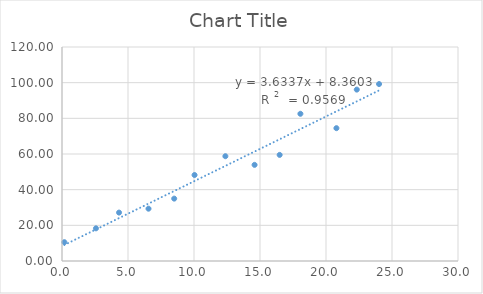
| Category | Series 0 |
|---|---|
| 0.17908833236415345 | 10.546 |
| 2.57302876919328 | 18.319 |
| 4.321392241195258 | 27.148 |
| 6.553315780896324 | 29.333 |
| 8.500213754776183 | 34.978 |
| 10.041796081907918 | 48.218 |
| 12.377698217533624 | 58.756 |
| 14.588588238960307 | 53.913 |
| 16.48885090078175 | 59.494 |
| 18.06068892523254 | 82.552 |
| 20.789195307454953 | 74.484 |
| 22.332024793597032 | 96.115 |
| 24.019876515262798 | 99.225 |